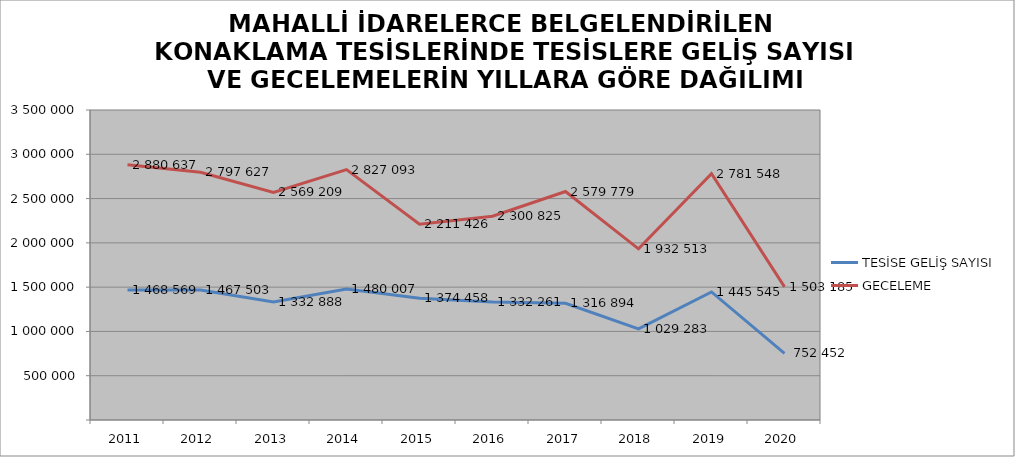
| Category | TESİSE GELİŞ SAYISI | GECELEME |
|---|---|---|
| 2011 | 1468569 | 2880637 |
| 2012 | 1467503 | 2797627 |
| 2013 | 1332888 | 2569209 |
| 2014 | 1480007 | 2827093 |
| 2015 | 1374458 | 2211426 |
| 2016 | 1332261 | 2300825 |
| 2017 | 1316894 | 2579779 |
| 2018 | 1029283 | 1932513 |
| 2019 | 1445545 | 2781548 |
| 2020 | 752452 | 1503185 |